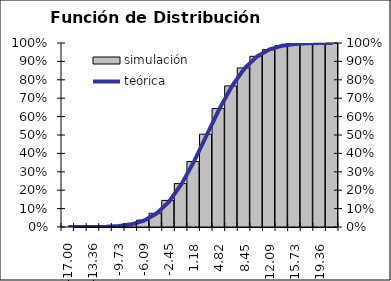
| Category | simulación |
|---|---|
| -17.0 | 0 |
| -15.181818181818182 | 0 |
| -13.363636363636363 | 0.001 |
| -11.545454545454545 | 0.002 |
| -9.727272727272727 | 0.007 |
| -7.909090909090908 | 0.016 |
| -6.09090909090909 | 0.037 |
| -4.272727272727272 | 0.075 |
| -2.4545454545454533 | 0.145 |
| -0.6363636363636351 | 0.236 |
| 1.181818181818183 | 0.356 |
| 3.000000000000001 | 0.504 |
| 4.818181818181819 | 0.644 |
| 6.636363636363638 | 0.767 |
| 8.454545454545455 | 0.864 |
| 10.272727272727273 | 0.928 |
| 12.090909090909092 | 0.964 |
| 13.90909090909091 | 0.986 |
| 15.727272727272728 | 0.994 |
| 17.545454545454547 | 0.997 |
| 19.363636363636363 | 0.999 |
| 23.0 | 1 |